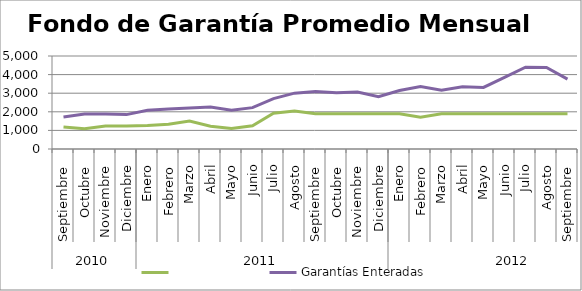
| Category | Series 2 | Garantías Enteradas |
|---|---|---|
| 0 | 1186.765 | 1723.136 |
| 1 | 1091.277 | 1878.561 |
| 2 | 1240.142 | 1886.493 |
| 3 | 1233.184 | 1848.941 |
| 4 | 1267.175 | 2079.773 |
| 5 | 1328.315 | 2151.804 |
| 6 | 1507.218 | 2200.488 |
| 7 | 1222.61 | 2253.818 |
| 8 | 1097.438 | 2081.441 |
| 9 | 1248.758 | 2223.666 |
| 10 | 1917.982 | 2706.525 |
| 11 | 2038.339 | 3002.384 |
| 12 | 1900.513 | 3095.395 |
| 13 | 1900.513 | 3029.373 |
| 14 | 1900.513 | 3060.179 |
| 15 | 1900.513 | 2809.042 |
| 16 | 1896.798 | 3141.641 |
| 17 | 1714.423 | 3362.648 |
| 18 | 1900.513 | 3154.118 |
| 19 | 1900.513 | 3348.058 |
| 20 | 1898.685 | 3308.859 |
| 21 | 1900.513 | 3850.375 |
| 22 | 1900.513 | 4400.539 |
| 23 | 1895.388 | 4383.327 |
| 24 | 1900.513 | 3757.632 |